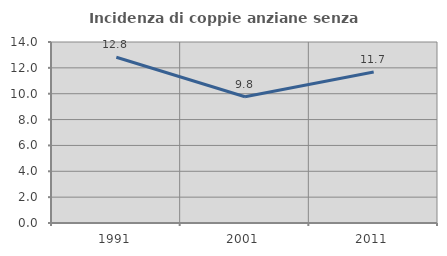
| Category | Incidenza di coppie anziane senza figli  |
|---|---|
| 1991.0 | 12.816 |
| 2001.0 | 9.769 |
| 2011.0 | 11.672 |